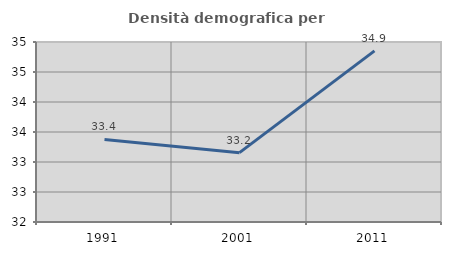
| Category | Densità demografica |
|---|---|
| 1991.0 | 33.377 |
| 2001.0 | 33.156 |
| 2011.0 | 34.853 |